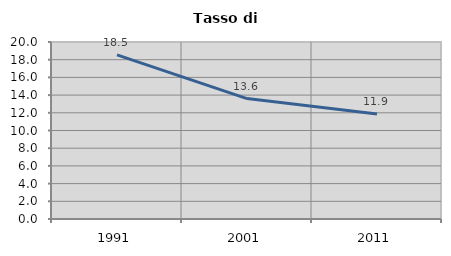
| Category | Tasso di disoccupazione   |
|---|---|
| 1991.0 | 18.548 |
| 2001.0 | 13.605 |
| 2011.0 | 11.86 |